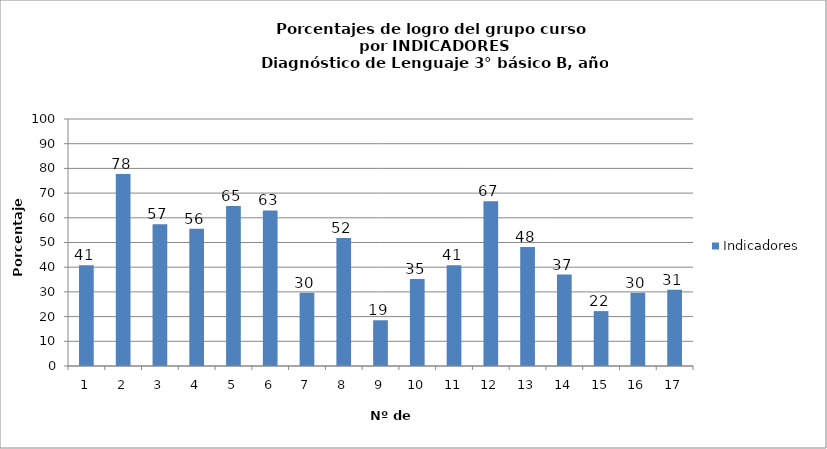
| Category | Indicadores |
|---|---|
| 0 | 40.741 |
| 1 | 77.778 |
| 2 | 57.407 |
| 3 | 55.556 |
| 4 | 64.815 |
| 5 | 62.963 |
| 6 | 29.63 |
| 7 | 51.852 |
| 8 | 18.519 |
| 9 | 35.185 |
| 10 | 40.741 |
| 11 | 66.667 |
| 12 | 48.148 |
| 13 | 37.037 |
| 14 | 22.222 |
| 15 | 29.63 |
| 16 | 30.864 |